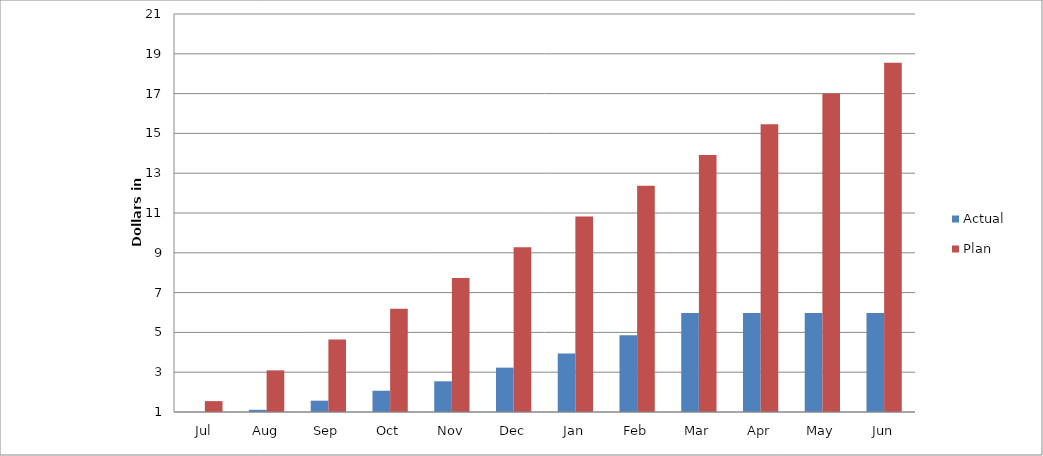
| Category | Actual | Plan |
|---|---|---|
| Jul | 695082.2 | 1545979.5 |
| Aug | 1109294.08 | 3091959 |
| Sep | 1569210.97 | 4637938.5 |
| Oct | 2068724.55 | 6183918 |
| Nov | 2542749.31 | 7729897.5 |
| Dec | 3229363.87 | 9275877 |
| Jan | 3945767.2 | 10821856.5 |
| Feb | 4859767.78 | 12367836 |
| Mar | 5978157.3 | 13913815.5 |
| Apr | 5978157.3 | 15459795 |
| May | 5978157.3 | 17005774.5 |
| Jun | 5978157.3 | 18551754 |